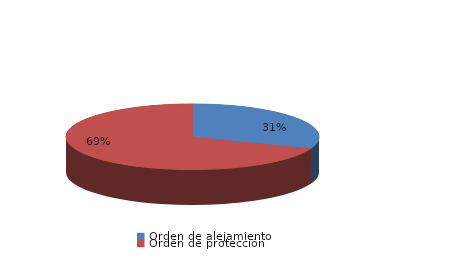
| Category | Series 0 |
|---|---|
| Orden de alejamiento | 4 |
| Orden de protección | 9 |